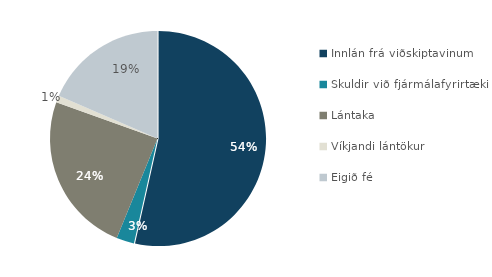
| Category | Series 0 |
|---|---|
| Innlán frá viðskiptavinum | 693043 |
| Skuldir við fjármálafyrirtæki | 34609 |
| Lántaka | 314412 |
| Víkjandi lántökur | 13340 |
| Eigið fé | 239610 |